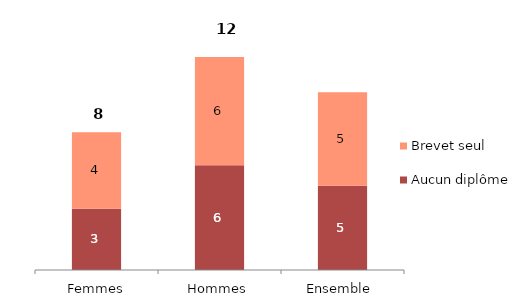
| Category | Aucun diplôme | Brevet seul |
|---|---|---|
| Ensemble  | 4.675 | 5.199 |
| Hommes | 5.819 | 6.009 |
| Femmes | 3.402 | 4.258 |